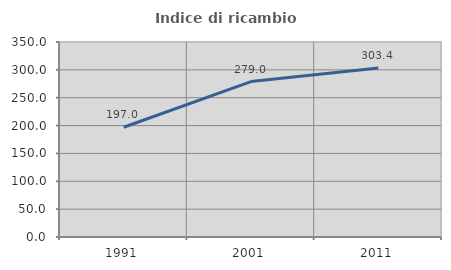
| Category | Indice di ricambio occupazionale  |
|---|---|
| 1991.0 | 197 |
| 2001.0 | 279.012 |
| 2011.0 | 303.448 |